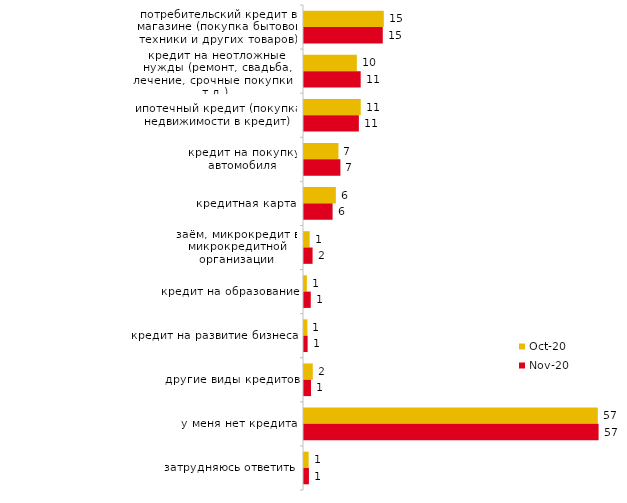
| Category | окт.20 | ноя.20 |
|---|---|---|
| потребительский кредит в магазине (покупка бытовой техники и других товаров) | 15.346 | 15.15 |
| кредит на неотложные нужды (ремонт, свадьба, лечение, срочные покупки и т.д.) | 10.164 | 10.9 |
| ипотечный кредит (покупка недвижимости в кредит) | 10.912 | 10.55 |
| кредит на покупку автомобиля | 6.627 | 7 |
| кредитная карта | 6.129 | 5.5 |
| заём, микрокредит в микрокредитной организации | 1.096 | 1.65 |
| кредит на образование | 0.548 | 1.3 |
| кредит на развитие бизнеса | 0.648 | 0.7 |
| другие виды кредитов | 1.694 | 1.35 |
| у меня нет кредита | 56.502 | 56.65 |
| затрудняюсь ответить | 0.897 | 0.95 |